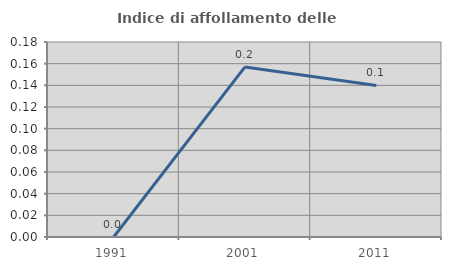
| Category | Indice di affollamento delle abitazioni  |
|---|---|
| 1991.0 | 0 |
| 2001.0 | 0.157 |
| 2011.0 | 0.14 |